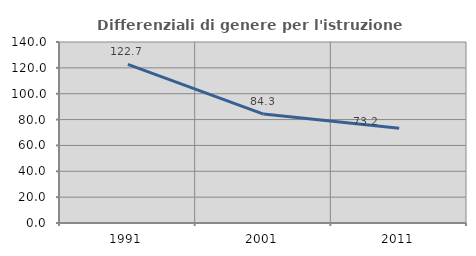
| Category | Differenziali di genere per l'istruzione superiore |
|---|---|
| 1991.0 | 122.667 |
| 2001.0 | 84.255 |
| 2011.0 | 73.227 |